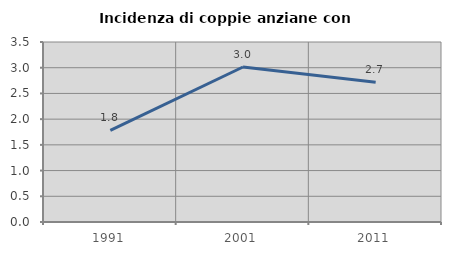
| Category | Incidenza di coppie anziane con figli |
|---|---|
| 1991.0 | 1.782 |
| 2001.0 | 3.014 |
| 2011.0 | 2.716 |